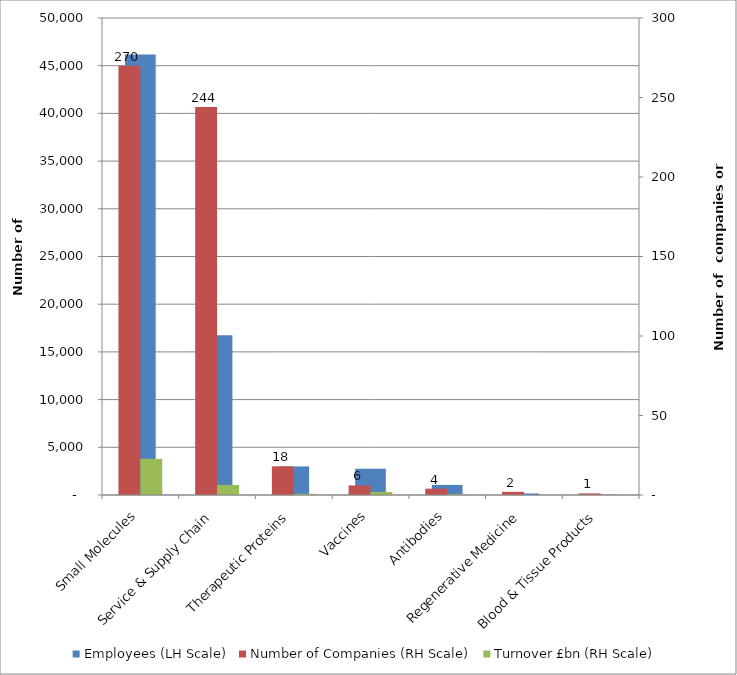
| Category | Employees (LH Scale) |
|---|---|
| Small Molecules | 46171.25 |
| Service & Supply Chain | 16756.25 |
| Therapeutic Proteins | 2993.5 |
| Vaccines | 2755 |
| Antibodies | 1059 |
| Regenerative Medicine | 164 |
| Blood & Tissue Products | 30 |